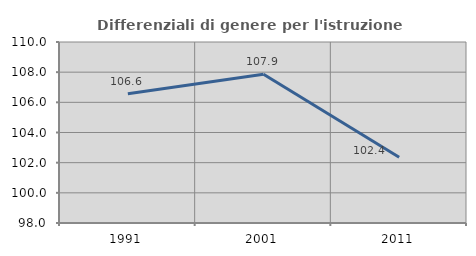
| Category | Differenziali di genere per l'istruzione superiore |
|---|---|
| 1991.0 | 106.572 |
| 2001.0 | 107.864 |
| 2011.0 | 102.363 |